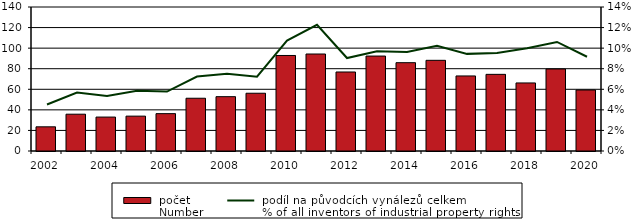
| Category |  počet
 Number |
|---|---|
| 2002.0 | 23.514 |
| 2003.0 | 35.779 |
| 2004.0 | 32.986 |
| 2005.0 | 33.902 |
| 2006.0 | 36.311 |
| 2007.0 | 51.291 |
| 2008.0 | 52.822 |
| 2009.0 | 56.161 |
| 2010.0 | 92.874 |
| 2011.0 | 94.295 |
| 2012.0 | 76.813 |
| 2013.0 | 92.307 |
| 2014.0 | 85.872 |
| 2015.0 | 88.159 |
| 2016.0 | 72.974 |
| 2017.0 | 74.526 |
| 2018.0 | 66.172 |
| 2019.0 | 79.724 |
| 2020.0 | 59.306 |